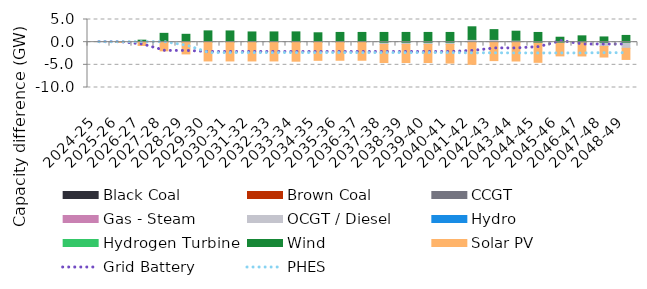
| Category | Black Coal | Brown Coal | CCGT | Gas - Steam | OCGT / Diesel | Hydro | Hydrogen Turbine | Wind | Solar PV |
|---|---|---|---|---|---|---|---|---|---|
| 2024-25 | 0 | 0 | 0 | 0 | 0 | 0 | 0 | 0 | 0 |
| 2025-26 | 0 | 0 | 0 | 0 | 0 | 0 | 0 | -0.074 | 0 |
| 2026-27 | 0 | 0 | 0 | 0 | 0 | 0 | 0 | 0.441 | -0.724 |
| 2027-28 | 0 | 0 | 0 | 0 | 0 | 0 | 0 | 1.945 | -1.915 |
| 2028-29 | 0 | 0 | 0 | 0 | 0 | 0 | 0 | 1.735 | -2.591 |
| 2029-30 | 0 | 0 | 0 | 0 | 0 | 0 | 0 | 2.491 | -4.143 |
| 2030-31 | 0 | 0 | 0 | 0 | 0 | 0 | 0 | 2.477 | -4.143 |
| 2031-32 | 0 | 0 | 0 | 0 | 0 | 0 | 0 | 2.253 | -4.143 |
| 2032-33 | 0 | 0 | 0 | 0 | 0 | 0 | 0 | 2.26 | -4.143 |
| 2033-34 | 0 | 0 | 0 | 0 | 0 | 0 | 0 | 2.267 | -4.2 |
| 2034-35 | 0 | 0 | 0 | 0 | 0 | 0 | 0 | 2.069 | -4.009 |
| 2035-36 | 0 | 0 | 0 | 0 | 0 | 0 | 0 | 2.147 | -3.991 |
| 2036-37 | 0 | 0 | 0 | 0 | 0 | 0 | 0 | 2.147 | -3.991 |
| 2037-38 | 0 | 0 | 0 | 0 | -0.496 | 0 | 0 | 2.147 | -3.991 |
| 2038-39 | 0 | 0 | 0 | 0 | -0.496 | 0 | 0 | 2.147 | -3.991 |
| 2039-40 | 0 | 0 | 0 | 0 | -0.496 | 0 | 0 | 2.147 | -3.991 |
| 2040-41 | 0 | 0 | 0 | 0 | -0.496 | 0 | 0 | 2.145 | -4.105 |
| 2041-42 | 0 | 0 | 0 | 0 | 0.608 | 0 | 0 | 2.782 | -4.889 |
| 2042-43 | 0 | 0 | 0 | 0 | 0.608 | 0 | 0 | 2.161 | -4.069 |
| 2043-44 | 0 | 0 | 0 | 0 | 0.437 | 0 | 0 | 1.981 | -4.155 |
| 2044-45 | 0 | 0 | 0 | 0 | -0.243 | 0 | 0 | 2.141 | -4.205 |
| 2045-46 | 0 | 0 | 0 | 0 | -0.243 | 0 | 0 | 1.089 | -2.785 |
| 2046-47 | 0 | 0 | 0 | 0 | -0.153 | 0 | 0 | 1.395 | -2.893 |
| 2047-48 | 0 | 0 | 0 | 0 | -0.947 | 0 | 0 | 1.152 | -2.331 |
| 2048-49 | 0 | 0 | 0 | 0 | -1.359 | 0 | 0 | 1.487 | -2.453 |